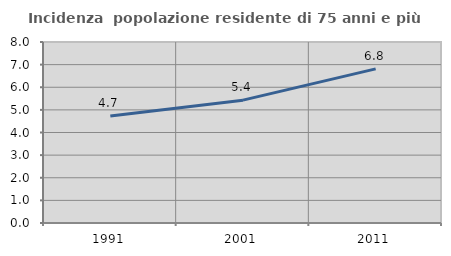
| Category | Incidenza  popolazione residente di 75 anni e più |
|---|---|
| 1991.0 | 4.734 |
| 2001.0 | 5.43 |
| 2011.0 | 6.811 |